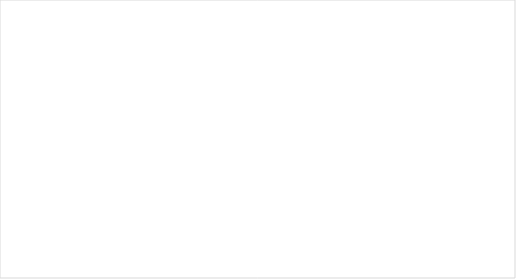
| Category | 2019 | 2020 |
|---|---|---|
| MARZO | 4076 | 3200 |
| ABRIL | 4410 | 1384 |
| MAYO | 5584 | 1381 |